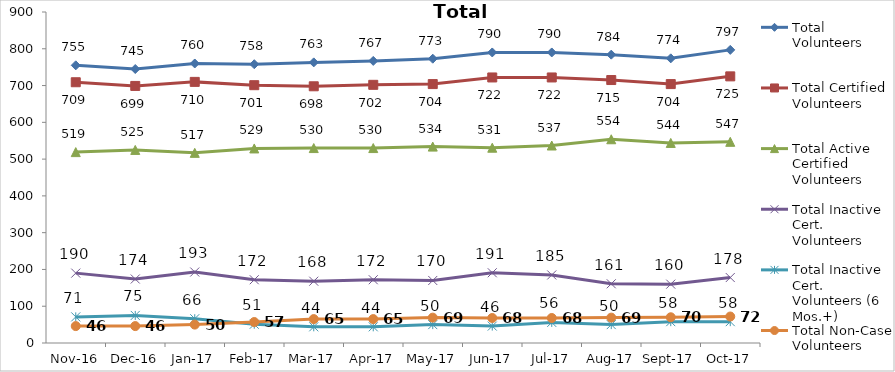
| Category | Total Volunteers | Total Certified Volunteers | Total Active Certified Volunteers | Total Inactive Cert. Volunteers | Total Inactive Cert. Volunteers (6 Mos.+) | Total Non-Case Volunteers |
|---|---|---|---|---|---|---|
| 2016-11-01 | 755 | 709 | 519 | 190 | 71 | 46 |
| 2016-12-01 | 745 | 699 | 525 | 174 | 75 | 46 |
| 2017-01-01 | 760 | 710 | 517 | 193 | 66 | 50 |
| 2017-02-01 | 758 | 701 | 529 | 172 | 51 | 57 |
| 2017-03-01 | 763 | 698 | 530 | 168 | 44 | 65 |
| 2017-04-01 | 767 | 702 | 530 | 172 | 44 | 65 |
| 2017-05-01 | 773 | 704 | 534 | 170 | 50 | 69 |
| 2017-06-01 | 790 | 722 | 531 | 191 | 46 | 68 |
| 2017-07-01 | 790 | 722 | 537 | 185 | 56 | 68 |
| 2017-08-01 | 784 | 715 | 554 | 161 | 50 | 69 |
| 2017-09-01 | 774 | 704 | 544 | 160 | 58 | 70 |
| 2017-10-01 | 797 | 725 | 547 | 178 | 58 | 72 |